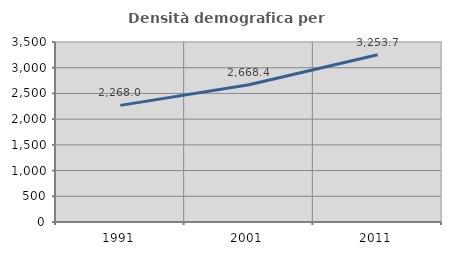
| Category | Densità demografica |
|---|---|
| 1991.0 | 2268.027 |
| 2001.0 | 2668.367 |
| 2011.0 | 3253.719 |